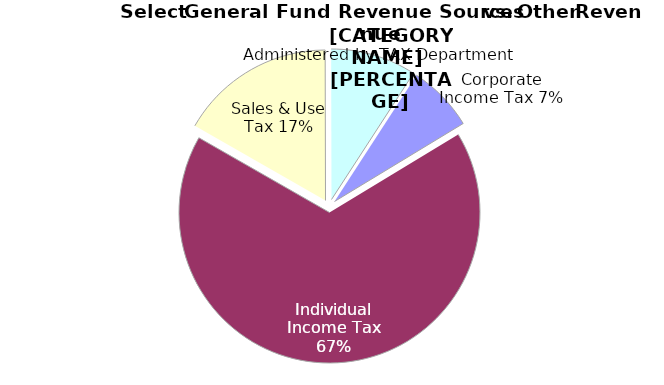
| Category | FY 2023 |
|---|---|
| 0 | 2031120000 |
| 1 | 18983555000 |
| 2 | 4734549000 |
| 3 | 2609863000 |